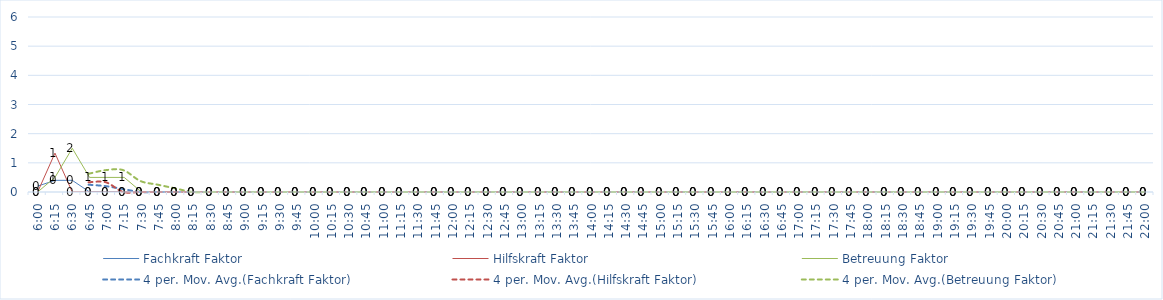
| Category | Fachkraft Faktor | Hilfskraft Faktor | Betreuung Faktor |
|---|---|---|---|
| 0.25 | 0.2 | 0 | 0 |
| 0.2604166666666667 | 0.4 | 1.333 | 0.5 |
| 0.2708333333333333 | 0.4 | 0 | 1.5 |
| 0.28125 | 0 | 0 | 0.5 |
| 0.2916666666666667 | 0 | 0 | 0.5 |
| 0.3020833333333333 | 0 | 0 | 0.5 |
| 0.3125 | 0 | 0 | 0 |
| 0.3229166666666667 | 0 | 0 | 0 |
| 0.3333333333333333 | 0 | 0 | 0 |
| 0.34375 | 0 | 0 | 0 |
| 0.3541666666666667 | 0 | 0 | 0 |
| 0.3645833333333333 | 0 | 0 | 0 |
| 0.375 | 0 | 0 | 0 |
| 0.3854166666666667 | 0 | 0 | 0 |
| 0.3958333333333333 | 0 | 0 | 0 |
| 0.40625 | 0 | 0 | 0 |
| 0.4166666666666667 | 0 | 0 | 0 |
| 0.4270833333333333 | 0 | 0 | 0 |
| 0.4375 | 0 | 0 | 0 |
| 0.4479166666666667 | 0 | 0 | 0 |
| 0.4583333333333333 | 0 | 0 | 0 |
| 0.46875 | 0 | 0 | 0 |
| 0.4791666666666667 | 0 | 0 | 0 |
| 0.4895833333333333 | 0 | 0 | 0 |
| 0.5 | 0 | 0 | 0 |
| 0.5104166666666666 | 0 | 0 | 0 |
| 0.5208333333333334 | 0 | 0 | 0 |
| 0.53125 | 0 | 0 | 0 |
| 0.5416666666666666 | 0 | 0 | 0 |
| 0.5520833333333334 | 0 | 0 | 0 |
| 0.5625 | 0 | 0 | 0 |
| 0.5729166666666666 | 0 | 0 | 0 |
| 0.5833333333333334 | 0 | 0 | 0 |
| 0.59375 | 0 | 0 | 0 |
| 0.6041666666666666 | 0 | 0 | 0 |
| 0.6145833333333334 | 0 | 0 | 0 |
| 0.625 | 0 | 0 | 0 |
| 0.6354166666666666 | 0 | 0 | 0 |
| 0.6458333333333334 | 0 | 0 | 0 |
| 0.65625 | 0 | 0 | 0 |
| 0.6666666666666666 | 0 | 0 | 0 |
| 0.6770833333333334 | 0 | 0 | 0 |
| 0.6875 | 0 | 0 | 0 |
| 0.6979166666666666 | 0 | 0 | 0 |
| 0.7083333333333334 | 0 | 0 | 0 |
| 0.71875 | 0 | 0 | 0 |
| 0.7291666666666666 | 0 | 0 | 0 |
| 0.7395833333333334 | 0 | 0 | 0 |
| 0.75 | 0 | 0 | 0 |
| 0.7604166666666666 | 0 | 0 | 0 |
| 0.7708333333333334 | 0 | 0 | 0 |
| 0.78125 | 0 | 0 | 0 |
| 0.7916666666666666 | 0 | 0 | 0 |
| 0.8020833333333334 | 0 | 0 | 0 |
| 0.8125 | 0 | 0 | 0 |
| 0.8229166666666666 | 0 | 0 | 0 |
| 0.8333333333333334 | 0 | 0 | 0 |
| 0.84375 | 0 | 0 | 0 |
| 0.8541666666666666 | 0 | 0 | 0 |
| 0.8645833333333334 | 0 | 0 | 0 |
| 0.875 | 0 | 0 | 0 |
| 0.8854166666666666 | 0 | 0 | 0 |
| 0.8958333333333334 | 0 | 0 | 0 |
| 0.90625 | 0 | 0 | 0 |
| 0.9166666666666666 | 0 | 0 | 0 |